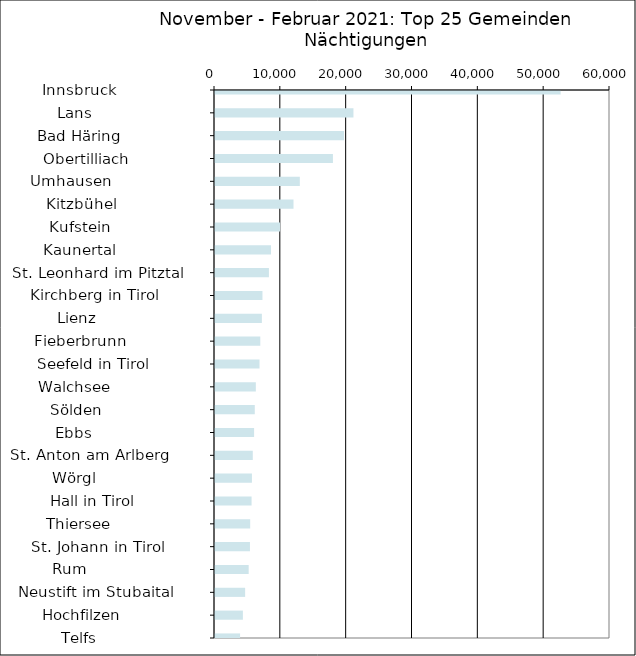
| Category | Series 0 |
|---|---|
|   Innsbruck                  | 52499 |
|   Lans                       | 21029 |
|   Bad Häring                 | 19597 |
|   Obertilliach               | 17913 |
|   Umhausen                   | 12884 |
|   Kitzbühel                  | 11924 |
|   Kufstein                   | 9893 |
|   Kaunertal                  | 8508 |
|   St. Leonhard im Pitztal    | 8190 |
|   Kirchberg in Tirol         | 7208 |
|   Lienz                      | 7121 |
|   Fieberbrunn                | 6878 |
|   Seefeld in Tirol           | 6761 |
|   Walchsee                   | 6201 |
|   Sölden                     | 6042 |
|   Ebbs                       | 5936 |
|   St. Anton am Arlberg       | 5738 |
|   Wörgl                      | 5609 |
|   Hall in Tirol              | 5554 |
|   Thiersee                   | 5344 |
|   St. Johann in Tirol        | 5309 |
|   Rum                        | 5113 |
|   Neustift im Stubaital      | 4576 |
|   Hochfilzen                 | 4236 |
|   Telfs                      | 3808 |